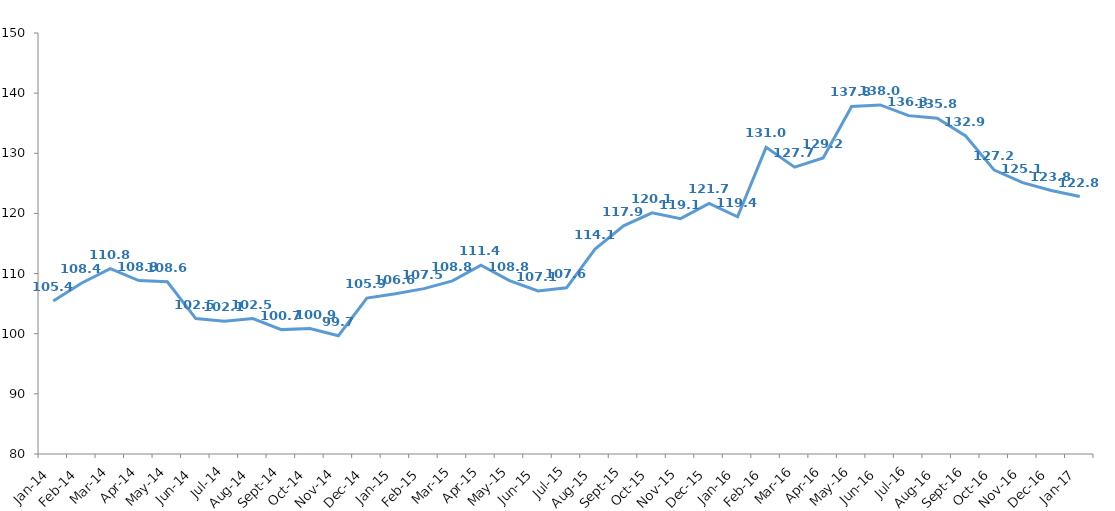
| Category | Series 0 |
|---|---|
| 2014-01-01 | 105.432 |
| 2014-02-01 | 108.43 |
| 2014-03-01 | 110.822 |
| 2014-04-01 | 108.837 |
| 2014-05-01 | 108.639 |
| 2014-06-01 | 102.522 |
| 2014-07-01 | 102.074 |
| 2014-08-01 | 102.511 |
| 2014-09-01 | 100.68 |
| 2014-10-01 | 100.878 |
| 2014-11-01 | 99.67 |
| 2014-12-01 | 105.93 |
| 2015-01-01 | 106.639 |
| 2015-02-01 | 107.498 |
| 2015-03-01 | 108.78 |
| 2015-04-01 | 111.393 |
| 2015-05-01 | 108.828 |
| 2015-06-01 | 107.114 |
| 2015-07-01 | 107.629 |
| 2015-08-01 | 114.064 |
| 2015-09-01 | 117.949 |
| 2015-10-01 | 120.109 |
| 2015-11-01 | 119.131 |
| 2015-12-01 | 121.671 |
| 2016-01-01 | 119.449 |
| 2016-02-01 | 130.986 |
| 2016-03-01 | 127.691 |
| 2016-04-01 | 129.225 |
| 2016-05-01 | 137.784 |
| 2016-06-01 | 138.034 |
| 2016-07-01 | 136.262 |
| 2016-08-01 | 135.83 |
| 2016-09-01 | 132.884 |
| 2016-10-01 | 127.203 |
| 2016-11-01 | 125.109 |
| 2016-12-01 | 123.802 |
| 2017-01-01 | 122.807 |